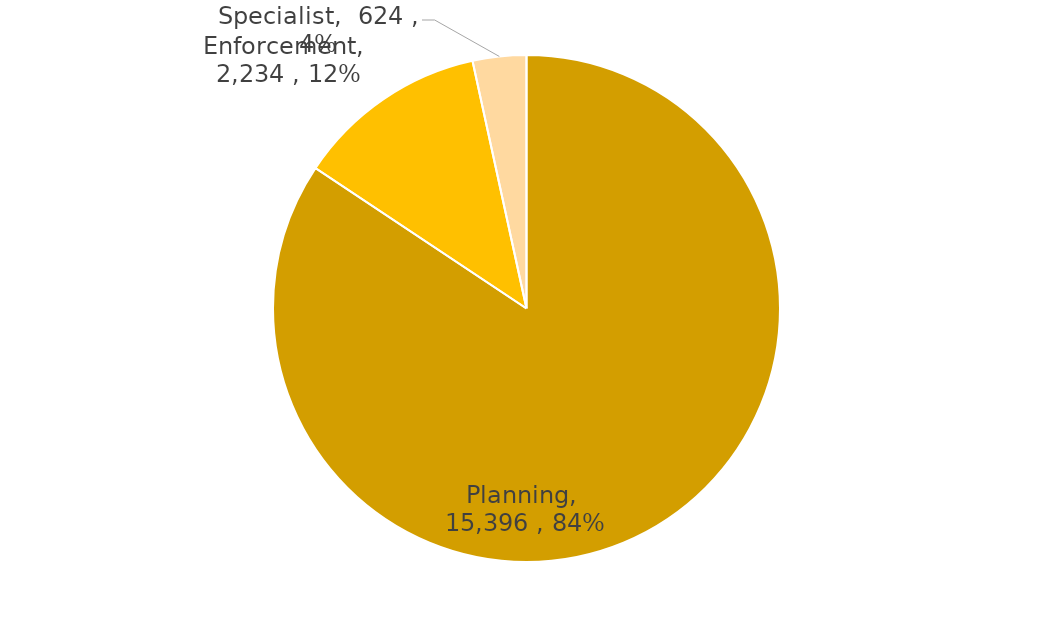
| Category | Series 0 |
|---|---|
| Planning | 15396 |
| Enforcement | 2234 |
| Specialist | 624 |